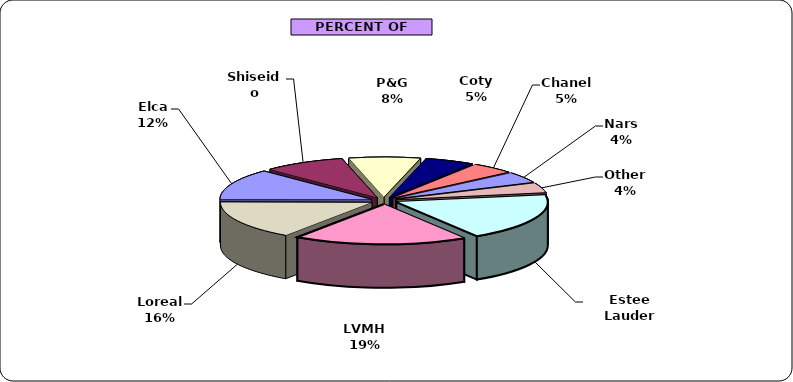
| Category | Series 0 |
|---|---|
| Estee Lauder | 46992 |
| LVMH | 46232 |
| Loreal | 38641 |
| Elca | 30653 |
| Shiseido | 21918 |
| P&G | 19034 |
| Coty | 13270 |
| Chanel | 11561 |
| Nars | 11014 |
| Other | 9827 |